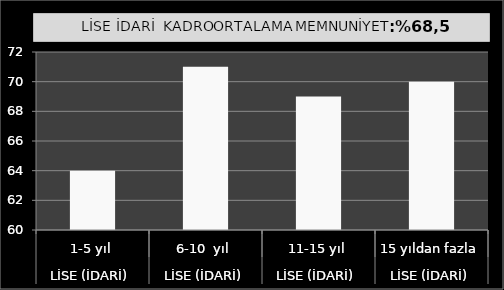
| Category | Series 0 |
|---|---|
| 0 | 64 |
| 1 | 71 |
| 2 | 69 |
| 3 | 70 |